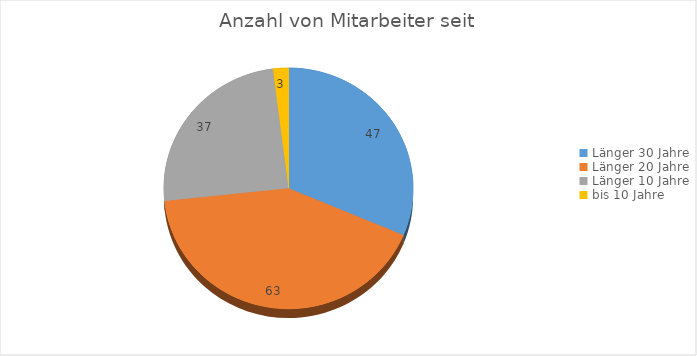
| Category | Ergebnis |
|---|---|
| Länger 30 Jahre | 47 |
| Länger 20 Jahre | 63 |
| Länger 10 Jahre | 37 |
| bis 10 Jahre | 3 |